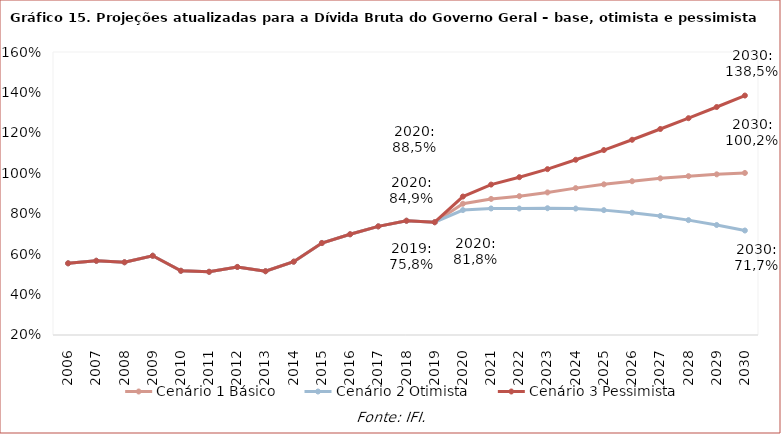
| Category | Cenário 1 Básico | Cenário 2 Otimista | Cenário 3 Pessimista |
|---|---|---|---|
| 2006.0 | 0.555 | 0.555 | 0.555 |
| 2007.0 | 0.567 | 0.567 | 0.567 |
| 2008.0 | 0.56 | 0.56 | 0.56 |
| 2009.0 | 0.592 | 0.592 | 0.592 |
| 2010.0 | 0.518 | 0.518 | 0.518 |
| 2011.0 | 0.513 | 0.513 | 0.513 |
| 2012.0 | 0.537 | 0.537 | 0.537 |
| 2013.0 | 0.515 | 0.515 | 0.515 |
| 2014.0 | 0.563 | 0.563 | 0.563 |
| 2015.0 | 0.655 | 0.655 | 0.655 |
| 2016.0 | 0.698 | 0.698 | 0.698 |
| 2017.0 | 0.737 | 0.737 | 0.737 |
| 2018.0 | 0.765 | 0.765 | 0.765 |
| 2019.0 | 0.758 | 0.758 | 0.758 |
| 2020.0 | 0.849 | 0.818 | 0.885 |
| 2021.0 | 0.873 | 0.826 | 0.944 |
| 2022.0 | 0.887 | 0.826 | 0.981 |
| 2023.0 | 0.905 | 0.827 | 1.021 |
| 2024.0 | 0.927 | 0.825 | 1.067 |
| 2025.0 | 0.945 | 0.818 | 1.115 |
| 2026.0 | 0.961 | 0.805 | 1.166 |
| 2027.0 | 0.975 | 0.789 | 1.219 |
| 2028.0 | 0.986 | 0.768 | 1.273 |
| 2029.0 | 0.995 | 0.744 | 1.328 |
| 2030.0 | 1.002 | 0.717 | 1.385 |